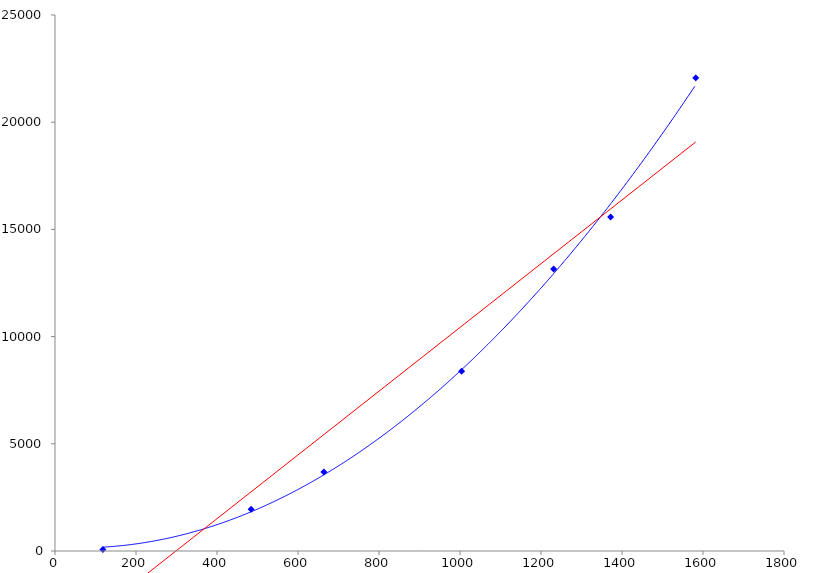
| Category | Series 0 |
|---|---|
| 118.0 | 70.221 |
| 484.0 | 1947.593 |
| 664.0 | 3687.745 |
| 1004.0 | 8383.323 |
| 1231.0 | 13153.797 |
| 1372.0 | 15575.714 |
| 1582.0 | 22067.799 |